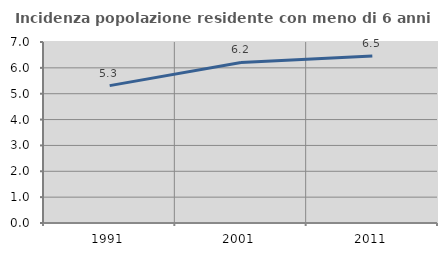
| Category | Incidenza popolazione residente con meno di 6 anni |
|---|---|
| 1991.0 | 5.312 |
| 2001.0 | 6.21 |
| 2011.0 | 6.456 |